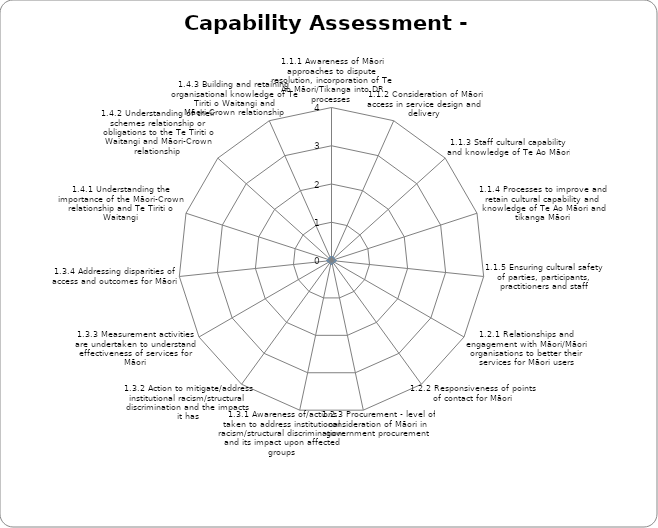
| Category | Maturity Score |
|---|---|
| 1.1.1 Awareness of Māori approaches to dispute resolution, incorporation of Te Ao Māori/Tikanga into DR processes | 0 |
| 1.1.2 Consideration of Māori access in service design and delivery | 0 |
| 1.1.3 Staff cultural capability and knowledge of Te Ao Māori | 0 |
| 1.1.4 Processes to improve and retain cultural capability and knowledge of Te Ao Māori and tikanga Māori | 0 |
| 1.1.5 Ensuring cultural safety of parties, participants, practitioners and staff | 0 |
| 1.2.1 Relationships and engagement with Māori/Māori organisations to better their services for Māori users | 0 |
| 1.2.2 Responsiveness of points of contact for Māori | 0 |
| 1.2.3 Procurement - level of consideration of Māori in government procurement | 0 |
| 1.3.1 Awareness of/actions taken to address institutional racism/structural discrimination and its impact upon affected groups | 0 |
| 1.3.2 Action to mitigate/address institutional racism/structural discrimination and the impacts it has | 0 |
| 1.3.3 Measurement activities are undertaken to understand effectiveness of services for Māori | 0 |
| 1.3.4 Addressing disparities of access and outcomes for Māori | 0 |
| 1.4.1 Understanding the importance of the Māori-Crown relationship and Te Tiriti o Waitangi | 0 |
| 1.4.2 Understanding of their schemes relationship or obligations to the Te Tiriti o Waitangi and Māori-Crown relationship | 0 |
| 1.4.3 Building and retaining organisational knowledge of Te Tiriti o Waitangi and Māori-Crown relationship | 0 |